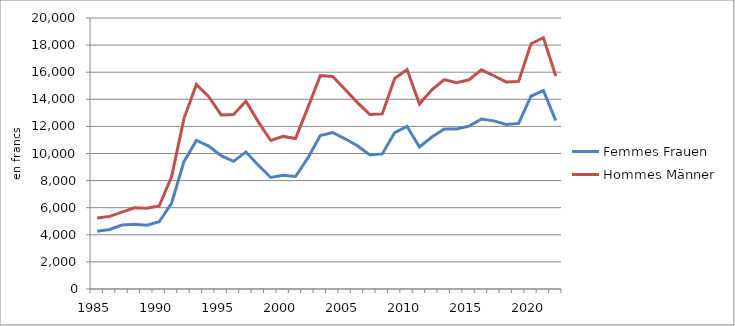
| Category | Femmes | Hommes |
|---|---|---|
| 1985.0 | 4267 | 5246 |
| 1986.0 | 4391 | 5360 |
| 1987.0 | 4716 | 5671 |
| 1988.0 | 4783 | 5995 |
| 1989.0 | 4713 | 5959 |
| 1990.0 | 4958 | 6124 |
| 1991.0 | 6329 | 8285 |
| 1992.0 | 9398 | 12578 |
| 1993.0 | 10959 | 15090 |
| 1994.0 | 10550 | 14194 |
| 1995.0 | 9839 | 12847 |
| 1996.0 | 9422 | 12879 |
| 1997.0 | 10116 | 13860 |
| 1998.0 | 9140 | 12335 |
| 1999.0 | 8233 | 10958 |
| 2000.0 | 8395 | 11261 |
| 2001.0 | 8303 | 11103 |
| 2002.0 | 9671.134 | 13383.052 |
| 2003.0 | 11318 | 15751 |
| 2004.0 | 11552 | 15681 |
| 2005.0 | 11083.893 | 14727.134 |
| 2006.0 | 10573.315 | 13758.203 |
| 2007.0 | 9896.443 | 12874.332 |
| 2008.0 | 9968.191 | 12923.812 |
| 2009.0 | 11543.493 | 15530.889 |
| 2010.0 | 11998.035 | 16196.541 |
| 2011.0 | 10485.39 | 13650.063 |
| 2012.0 | 11213.954 | 14697.251 |
| 2013.0 | 11810.603 | 15450.04 |
| 2014.0 | 11803.182 | 15229.671 |
| 2015.0 | 12019.426 | 15440.628 |
| 2016.0 | 12537.407 | 16172.832 |
| 2017.0 | 12409.746 | 15737.208 |
| 2018.0 | 12136.441 | 15284.971 |
| 2019.0 | 12221.546 | 15322.035 |
| 2020.0 | 14233.743 | 18099.251 |
| 2021.0 | 14642.289 | 18543.96 |
| 2022.0 | 12427.8 | 15725 |